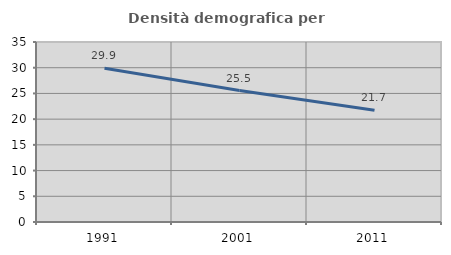
| Category | Densità demografica |
|---|---|
| 1991.0 | 29.892 |
| 2001.0 | 25.55 |
| 2011.0 | 21.714 |